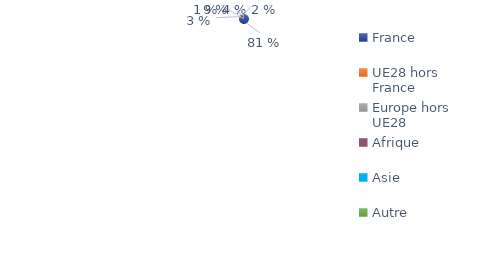
| Category | Series 0 |
|---|---|
| France | 0.813 |
| UE28 hors France | 0.032 |
| Europe hors UE28 | 0.009 |
| Afrique | 0.088 |
| Asie | 0.04 |
| Autre | 0.018 |